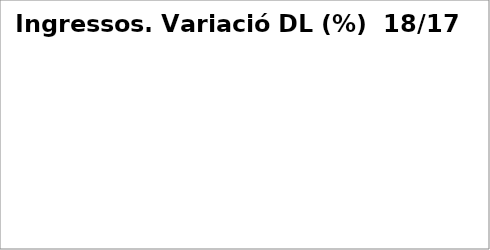
| Category | Series 0 |
|---|---|
| Impostos directes | -0.047 |
| Impostos indirectes | 0.078 |
| Taxes, preus públics i altres ingressos | 0.046 |
| Transferències corrents | -0.008 |
| Ingressos patrimonials | -0.165 |
| Venda d'inversions reals | -0.693 |
| Transferències de capital | 0.785 |
| Actius financers* | 0 |
| Passius financers | 0.487 |